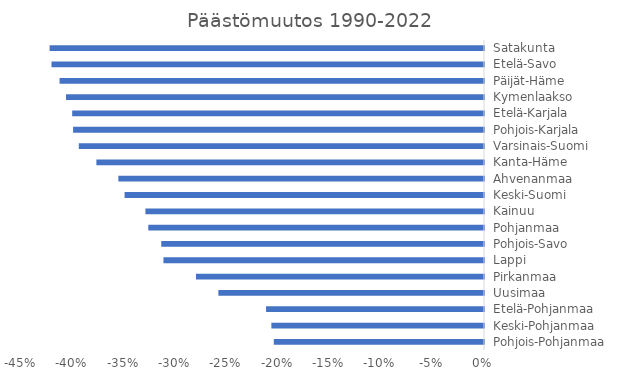
| Category | Päästömuutos 1990-2022 |
|---|---|
| Pohjois-Pohjanmaa | -0.205 |
| Keski-Pohjanmaa | -0.207 |
| Etelä-Pohjanmaa | -0.212 |
| Uusimaa | -0.259 |
| Pirkanmaa | -0.281 |
| Lappi | -0.312 |
| Pohjois-Savo | -0.314 |
| Pohjanmaa | -0.327 |
| Kainuu | -0.33 |
| Keski-Suomi | -0.35 |
| Ahvenanmaa | -0.356 |
| Kanta-Häme | -0.378 |
| Varsinais-Suomi | -0.395 |
| Pohjois-Karjala | -0.4 |
| Etelä-Karjala | -0.401 |
| Kymenlaakso | -0.407 |
| Päijät-Häme | -0.413 |
| Etelä-Savo | -0.421 |
| Satakunta | -0.423 |